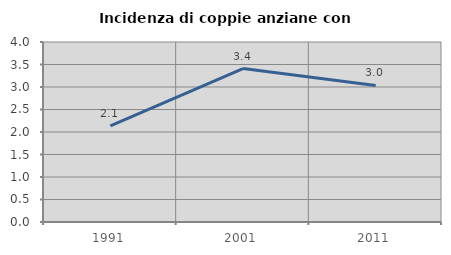
| Category | Incidenza di coppie anziane con figli |
|---|---|
| 1991.0 | 2.138 |
| 2001.0 | 3.411 |
| 2011.0 | 3.035 |